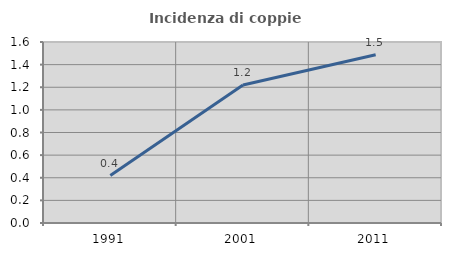
| Category | Incidenza di coppie miste |
|---|---|
| 1991.0 | 0.42 |
| 2001.0 | 1.22 |
| 2011.0 | 1.487 |